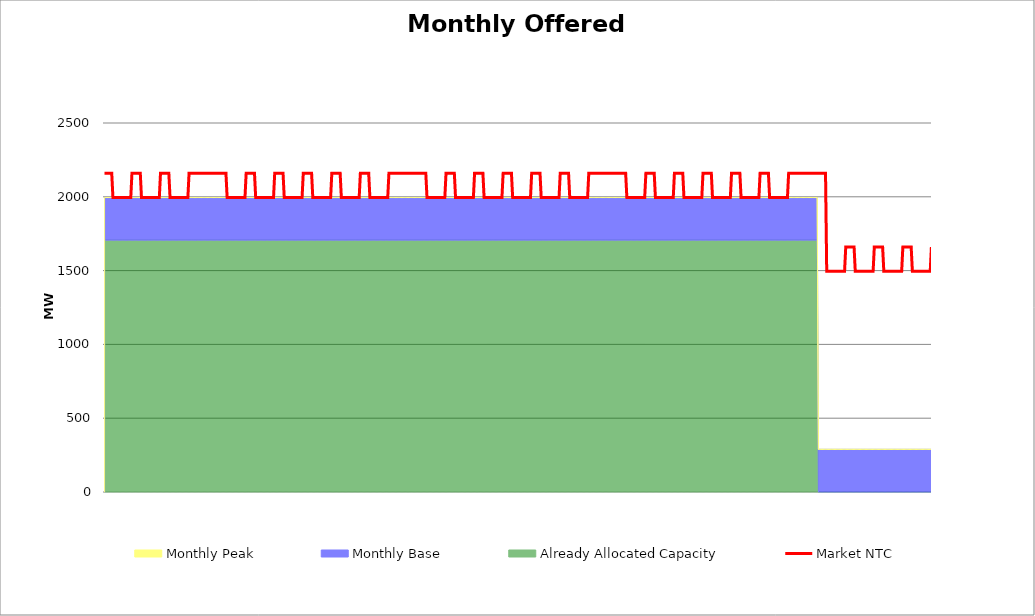
| Category | Market NTC |
|---|---|
| 0 | 2160 |
| 1 | 2160 |
| 2 | 2160 |
| 3 | 2160 |
| 4 | 2160 |
| 5 | 2160 |
| 6 | 2160 |
| 7 | 1995 |
| 8 | 1995 |
| 9 | 1995 |
| 10 | 1995 |
| 11 | 1995 |
| 12 | 1995 |
| 13 | 1995 |
| 14 | 1995 |
| 15 | 1995 |
| 16 | 1995 |
| 17 | 1995 |
| 18 | 1995 |
| 19 | 1995 |
| 20 | 1995 |
| 21 | 1995 |
| 22 | 1995 |
| 23 | 2160 |
| 24 | 2160 |
| 25 | 2160 |
| 26 | 2160 |
| 27 | 2160 |
| 28 | 2160 |
| 29 | 2160 |
| 30 | 2160 |
| 31 | 1995 |
| 32 | 1995 |
| 33 | 1995 |
| 34 | 1995 |
| 35 | 1995 |
| 36 | 1995 |
| 37 | 1995 |
| 38 | 1995 |
| 39 | 1995 |
| 40 | 1995 |
| 41 | 1995 |
| 42 | 1995 |
| 43 | 1995 |
| 44 | 1995 |
| 45 | 1995 |
| 46 | 1995 |
| 47 | 2160 |
| 48 | 2160 |
| 49 | 2160 |
| 50 | 2160 |
| 51 | 2160 |
| 52 | 2160 |
| 53 | 2160 |
| 54 | 2160 |
| 55 | 1995 |
| 56 | 1995 |
| 57 | 1995 |
| 58 | 1995 |
| 59 | 1995 |
| 60 | 1995 |
| 61 | 1995 |
| 62 | 1995 |
| 63 | 1995 |
| 64 | 1995 |
| 65 | 1995 |
| 66 | 1995 |
| 67 | 1995 |
| 68 | 1995 |
| 69 | 1995 |
| 70 | 1995 |
| 71 | 2160 |
| 72 | 2160 |
| 73 | 2160 |
| 74 | 2160 |
| 75 | 2160 |
| 76 | 2160 |
| 77 | 2160 |
| 78 | 2160 |
| 79 | 2160 |
| 80 | 2160 |
| 81 | 2160 |
| 82 | 2160 |
| 83 | 2160 |
| 84 | 2160 |
| 85 | 2160 |
| 86 | 2160 |
| 87 | 2160 |
| 88 | 2160 |
| 89 | 2160 |
| 90 | 2160 |
| 91 | 2160 |
| 92 | 2160 |
| 93 | 2160 |
| 94 | 2160 |
| 95 | 2160 |
| 96 | 2160 |
| 97 | 2160 |
| 98 | 2160 |
| 99 | 2160 |
| 100 | 2160 |
| 101 | 2160 |
| 102 | 2160 |
| 103 | 1995 |
| 104 | 1995 |
| 105 | 1995 |
| 106 | 1995 |
| 107 | 1995 |
| 108 | 1995 |
| 109 | 1995 |
| 110 | 1995 |
| 111 | 1995 |
| 112 | 1995 |
| 113 | 1995 |
| 114 | 1995 |
| 115 | 1995 |
| 116 | 1995 |
| 117 | 1995 |
| 118 | 1995 |
| 119 | 2160 |
| 120 | 2160 |
| 121 | 2160 |
| 122 | 2160 |
| 123 | 2160 |
| 124 | 2160 |
| 125 | 2160 |
| 126 | 2160 |
| 127 | 1995 |
| 128 | 1995 |
| 129 | 1995 |
| 130 | 1995 |
| 131 | 1995 |
| 132 | 1995 |
| 133 | 1995 |
| 134 | 1995 |
| 135 | 1995 |
| 136 | 1995 |
| 137 | 1995 |
| 138 | 1995 |
| 139 | 1995 |
| 140 | 1995 |
| 141 | 1995 |
| 142 | 1995 |
| 143 | 2160 |
| 144 | 2160 |
| 145 | 2160 |
| 146 | 2160 |
| 147 | 2160 |
| 148 | 2160 |
| 149 | 2160 |
| 150 | 2160 |
| 151 | 1995 |
| 152 | 1995 |
| 153 | 1995 |
| 154 | 1995 |
| 155 | 1995 |
| 156 | 1995 |
| 157 | 1995 |
| 158 | 1995 |
| 159 | 1995 |
| 160 | 1995 |
| 161 | 1995 |
| 162 | 1995 |
| 163 | 1995 |
| 164 | 1995 |
| 165 | 1995 |
| 166 | 1995 |
| 167 | 2160 |
| 168 | 2160 |
| 169 | 2160 |
| 170 | 2160 |
| 171 | 2160 |
| 172 | 2160 |
| 173 | 2160 |
| 174 | 2160 |
| 175 | 1995 |
| 176 | 1995 |
| 177 | 1995 |
| 178 | 1995 |
| 179 | 1995 |
| 180 | 1995 |
| 181 | 1995 |
| 182 | 1995 |
| 183 | 1995 |
| 184 | 1995 |
| 185 | 1995 |
| 186 | 1995 |
| 187 | 1995 |
| 188 | 1995 |
| 189 | 1995 |
| 190 | 1995 |
| 191 | 2160 |
| 192 | 2160 |
| 193 | 2160 |
| 194 | 2160 |
| 195 | 2160 |
| 196 | 2160 |
| 197 | 2160 |
| 198 | 2160 |
| 199 | 1995 |
| 200 | 1995 |
| 201 | 1995 |
| 202 | 1995 |
| 203 | 1995 |
| 204 | 1995 |
| 205 | 1995 |
| 206 | 1995 |
| 207 | 1995 |
| 208 | 1995 |
| 209 | 1995 |
| 210 | 1995 |
| 211 | 1995 |
| 212 | 1995 |
| 213 | 1995 |
| 214 | 1995 |
| 215 | 2160 |
| 216 | 2160 |
| 217 | 2160 |
| 218 | 2160 |
| 219 | 2160 |
| 220 | 2160 |
| 221 | 2160 |
| 222 | 2160 |
| 223 | 1995 |
| 224 | 1995 |
| 225 | 1995 |
| 226 | 1995 |
| 227 | 1995 |
| 228 | 1995 |
| 229 | 1995 |
| 230 | 1995 |
| 231 | 1995 |
| 232 | 1995 |
| 233 | 1995 |
| 234 | 1995 |
| 235 | 1995 |
| 236 | 1995 |
| 237 | 1995 |
| 238 | 1995 |
| 239 | 2160 |
| 240 | 2160 |
| 241 | 2160 |
| 242 | 2160 |
| 243 | 2160 |
| 244 | 2160 |
| 245 | 2160 |
| 246 | 2160 |
| 247 | 2160 |
| 248 | 2160 |
| 249 | 2160 |
| 250 | 2160 |
| 251 | 2160 |
| 252 | 2160 |
| 253 | 2160 |
| 254 | 2160 |
| 255 | 2160 |
| 256 | 2160 |
| 257 | 2160 |
| 258 | 2160 |
| 259 | 2160 |
| 260 | 2160 |
| 261 | 2160 |
| 262 | 2160 |
| 263 | 2160 |
| 264 | 2160 |
| 265 | 2160 |
| 266 | 2160 |
| 267 | 2160 |
| 268 | 2160 |
| 269 | 2160 |
| 270 | 2160 |
| 271 | 1995 |
| 272 | 1995 |
| 273 | 1995 |
| 274 | 1995 |
| 275 | 1995 |
| 276 | 1995 |
| 277 | 1995 |
| 278 | 1995 |
| 279 | 1995 |
| 280 | 1995 |
| 281 | 1995 |
| 282 | 1995 |
| 283 | 1995 |
| 284 | 1995 |
| 285 | 1995 |
| 286 | 1995 |
| 287 | 2160 |
| 288 | 2160 |
| 289 | 2160 |
| 290 | 2160 |
| 291 | 2160 |
| 292 | 2160 |
| 293 | 2160 |
| 294 | 2160 |
| 295 | 1995 |
| 296 | 1995 |
| 297 | 1995 |
| 298 | 1995 |
| 299 | 1995 |
| 300 | 1995 |
| 301 | 1995 |
| 302 | 1995 |
| 303 | 1995 |
| 304 | 1995 |
| 305 | 1995 |
| 306 | 1995 |
| 307 | 1995 |
| 308 | 1995 |
| 309 | 1995 |
| 310 | 1995 |
| 311 | 2160 |
| 312 | 2160 |
| 313 | 2160 |
| 314 | 2160 |
| 315 | 2160 |
| 316 | 2160 |
| 317 | 2160 |
| 318 | 2160 |
| 319 | 1995 |
| 320 | 1995 |
| 321 | 1995 |
| 322 | 1995 |
| 323 | 1995 |
| 324 | 1995 |
| 325 | 1995 |
| 326 | 1995 |
| 327 | 1995 |
| 328 | 1995 |
| 329 | 1995 |
| 330 | 1995 |
| 331 | 1995 |
| 332 | 1995 |
| 333 | 1995 |
| 334 | 1995 |
| 335 | 2160 |
| 336 | 2160 |
| 337 | 2160 |
| 338 | 2160 |
| 339 | 2160 |
| 340 | 2160 |
| 341 | 2160 |
| 342 | 2160 |
| 343 | 1995 |
| 344 | 1995 |
| 345 | 1995 |
| 346 | 1995 |
| 347 | 1995 |
| 348 | 1995 |
| 349 | 1995 |
| 350 | 1995 |
| 351 | 1995 |
| 352 | 1995 |
| 353 | 1995 |
| 354 | 1995 |
| 355 | 1995 |
| 356 | 1995 |
| 357 | 1995 |
| 358 | 1995 |
| 359 | 2160 |
| 360 | 2160 |
| 361 | 2160 |
| 362 | 2160 |
| 363 | 2160 |
| 364 | 2160 |
| 365 | 2160 |
| 366 | 2160 |
| 367 | 1995 |
| 368 | 1995 |
| 369 | 1995 |
| 370 | 1995 |
| 371 | 1995 |
| 372 | 1995 |
| 373 | 1995 |
| 374 | 1995 |
| 375 | 1995 |
| 376 | 1995 |
| 377 | 1995 |
| 378 | 1995 |
| 379 | 1995 |
| 380 | 1995 |
| 381 | 1995 |
| 382 | 1995 |
| 383 | 2160 |
| 384 | 2160 |
| 385 | 2160 |
| 386 | 2160 |
| 387 | 2160 |
| 388 | 2160 |
| 389 | 2160 |
| 390 | 2160 |
| 391 | 1995 |
| 392 | 1995 |
| 393 | 1995 |
| 394 | 1995 |
| 395 | 1995 |
| 396 | 1995 |
| 397 | 1995 |
| 398 | 1995 |
| 399 | 1995 |
| 400 | 1995 |
| 401 | 1995 |
| 402 | 1995 |
| 403 | 1995 |
| 404 | 1995 |
| 405 | 1995 |
| 406 | 1995 |
| 407 | 2160 |
| 408 | 2160 |
| 409 | 2160 |
| 410 | 2160 |
| 411 | 2160 |
| 412 | 2160 |
| 413 | 2160 |
| 414 | 2160 |
| 415 | 2160 |
| 416 | 2160 |
| 417 | 2160 |
| 418 | 2160 |
| 419 | 2160 |
| 420 | 2160 |
| 421 | 2160 |
| 422 | 2160 |
| 423 | 2160 |
| 424 | 2160 |
| 425 | 2160 |
| 426 | 2160 |
| 427 | 2160 |
| 428 | 2160 |
| 429 | 2160 |
| 430 | 2160 |
| 431 | 2160 |
| 432 | 2160 |
| 433 | 2160 |
| 434 | 2160 |
| 435 | 2160 |
| 436 | 2160 |
| 437 | 2160 |
| 438 | 2160 |
| 439 | 1995 |
| 440 | 1995 |
| 441 | 1995 |
| 442 | 1995 |
| 443 | 1995 |
| 444 | 1995 |
| 445 | 1995 |
| 446 | 1995 |
| 447 | 1995 |
| 448 | 1995 |
| 449 | 1995 |
| 450 | 1995 |
| 451 | 1995 |
| 452 | 1995 |
| 453 | 1995 |
| 454 | 1995 |
| 455 | 2160 |
| 456 | 2160 |
| 457 | 2160 |
| 458 | 2160 |
| 459 | 2160 |
| 460 | 2160 |
| 461 | 2160 |
| 462 | 2160 |
| 463 | 1995 |
| 464 | 1995 |
| 465 | 1995 |
| 466 | 1995 |
| 467 | 1995 |
| 468 | 1995 |
| 469 | 1995 |
| 470 | 1995 |
| 471 | 1995 |
| 472 | 1995 |
| 473 | 1995 |
| 474 | 1995 |
| 475 | 1995 |
| 476 | 1995 |
| 477 | 1995 |
| 478 | 1995 |
| 479 | 2160 |
| 480 | 2160 |
| 481 | 2160 |
| 482 | 2160 |
| 483 | 2160 |
| 484 | 2160 |
| 485 | 2160 |
| 486 | 2160 |
| 487 | 1995 |
| 488 | 1995 |
| 489 | 1995 |
| 490 | 1995 |
| 491 | 1995 |
| 492 | 1995 |
| 493 | 1995 |
| 494 | 1995 |
| 495 | 1995 |
| 496 | 1995 |
| 497 | 1995 |
| 498 | 1995 |
| 499 | 1995 |
| 500 | 1995 |
| 501 | 1995 |
| 502 | 1995 |
| 503 | 2160 |
| 504 | 2160 |
| 505 | 2160 |
| 506 | 2160 |
| 507 | 2160 |
| 508 | 2160 |
| 509 | 2160 |
| 510 | 2160 |
| 511 | 1995 |
| 512 | 1995 |
| 513 | 1995 |
| 514 | 1995 |
| 515 | 1995 |
| 516 | 1995 |
| 517 | 1995 |
| 518 | 1995 |
| 519 | 1995 |
| 520 | 1995 |
| 521 | 1995 |
| 522 | 1995 |
| 523 | 1995 |
| 524 | 1995 |
| 525 | 1995 |
| 526 | 1995 |
| 527 | 2160 |
| 528 | 2160 |
| 529 | 2160 |
| 530 | 2160 |
| 531 | 2160 |
| 532 | 2160 |
| 533 | 2160 |
| 534 | 2160 |
| 535 | 1995 |
| 536 | 1995 |
| 537 | 1995 |
| 538 | 1995 |
| 539 | 1995 |
| 540 | 1995 |
| 541 | 1995 |
| 542 | 1995 |
| 543 | 1995 |
| 544 | 1995 |
| 545 | 1995 |
| 546 | 1995 |
| 547 | 1995 |
| 548 | 1995 |
| 549 | 1995 |
| 550 | 1995 |
| 551 | 2160 |
| 552 | 2160 |
| 553 | 2160 |
| 554 | 2160 |
| 555 | 2160 |
| 556 | 2160 |
| 557 | 2160 |
| 558 | 2160 |
| 559 | 1995 |
| 560 | 1995 |
| 561 | 1995 |
| 562 | 1995 |
| 563 | 1995 |
| 564 | 1995 |
| 565 | 1995 |
| 566 | 1995 |
| 567 | 1995 |
| 568 | 1995 |
| 569 | 1995 |
| 570 | 1995 |
| 571 | 1995 |
| 572 | 1995 |
| 573 | 1995 |
| 574 | 1995 |
| 575 | 2160 |
| 576 | 2160 |
| 577 | 2160 |
| 578 | 2160 |
| 579 | 2160 |
| 580 | 2160 |
| 581 | 2160 |
| 582 | 2160 |
| 583 | 2160 |
| 584 | 2160 |
| 585 | 2160 |
| 586 | 2160 |
| 587 | 2160 |
| 588 | 2160 |
| 589 | 2160 |
| 590 | 2160 |
| 591 | 2160 |
| 592 | 2160 |
| 593 | 2160 |
| 594 | 2160 |
| 595 | 2160 |
| 596 | 2160 |
| 597 | 2160 |
| 598 | 2160 |
| 599 | 2160 |
| 600 | 2160 |
| 601 | 2160 |
| 602 | 2160 |
| 603 | 2160 |
| 604 | 2160 |
| 605 | 2160 |
| 606 | 2160 |
| 607 | 1495 |
| 608 | 1495 |
| 609 | 1495 |
| 610 | 1495 |
| 611 | 1495 |
| 612 | 1495 |
| 613 | 1495 |
| 614 | 1495 |
| 615 | 1495 |
| 616 | 1495 |
| 617 | 1495 |
| 618 | 1495 |
| 619 | 1495 |
| 620 | 1495 |
| 621 | 1495 |
| 622 | 1495 |
| 623 | 1660 |
| 624 | 1660 |
| 625 | 1660 |
| 626 | 1660 |
| 627 | 1660 |
| 628 | 1660 |
| 629 | 1660 |
| 630 | 1660 |
| 631 | 1495 |
| 632 | 1495 |
| 633 | 1495 |
| 634 | 1495 |
| 635 | 1495 |
| 636 | 1495 |
| 637 | 1495 |
| 638 | 1495 |
| 639 | 1495 |
| 640 | 1495 |
| 641 | 1495 |
| 642 | 1495 |
| 643 | 1495 |
| 644 | 1495 |
| 645 | 1495 |
| 646 | 1495 |
| 647 | 1660 |
| 648 | 1660 |
| 649 | 1660 |
| 650 | 1660 |
| 651 | 1660 |
| 652 | 1660 |
| 653 | 1660 |
| 654 | 1660 |
| 655 | 1495 |
| 656 | 1495 |
| 657 | 1495 |
| 658 | 1495 |
| 659 | 1495 |
| 660 | 1495 |
| 661 | 1495 |
| 662 | 1495 |
| 663 | 1495 |
| 664 | 1495 |
| 665 | 1495 |
| 666 | 1495 |
| 667 | 1495 |
| 668 | 1495 |
| 669 | 1495 |
| 670 | 1495 |
| 671 | 1660 |
| 672 | 1660 |
| 673 | 1660 |
| 674 | 1660 |
| 675 | 1660 |
| 676 | 1660 |
| 677 | 1660 |
| 678 | 1660 |
| 679 | 1495 |
| 680 | 1495 |
| 681 | 1495 |
| 682 | 1495 |
| 683 | 1495 |
| 684 | 1495 |
| 685 | 1495 |
| 686 | 1495 |
| 687 | 1495 |
| 688 | 1495 |
| 689 | 1495 |
| 690 | 1495 |
| 691 | 1495 |
| 692 | 1495 |
| 693 | 1495 |
| 694 | 1495 |
| 695 | 1660 |